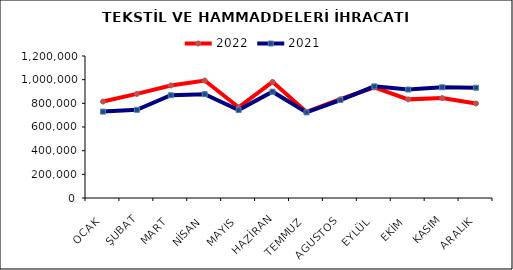
| Category | 2022 | 2021 |
|---|---|---|
| OCAK | 814863.341 | 730163.281 |
| ŞUBAT | 879872.412 | 744922.844 |
| MART | 950843.482 | 868398.217 |
| NİSAN | 993034.534 | 877321.177 |
| MAYIS | 766320.466 | 743235.715 |
| HAZİRAN | 981429.125 | 898555.291 |
| TEMMUZ | 727107.976 | 723407.649 |
| AGUSTOS | 834825.326 | 827953.613 |
| EYLÜL | 933997.454 | 943339.613 |
| EKİM | 833547.727 | 916736.536 |
| KASIM | 844343.084 | 935903.668 |
| ARALIK | 798593.566 | 931931.279 |